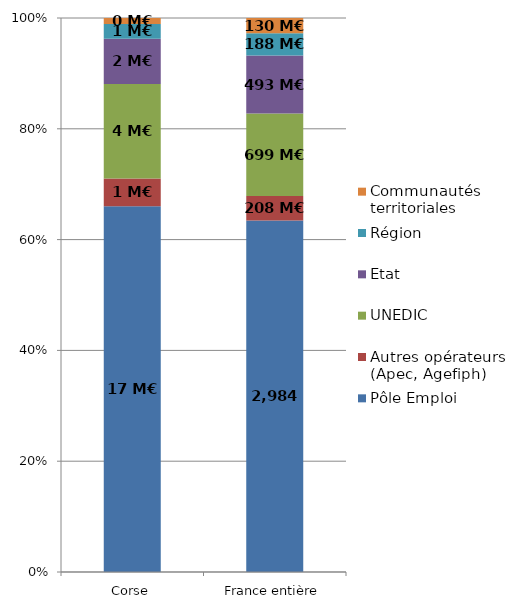
| Category | Pôle Emploi | Autres opérateurs (Apec, Agefiph) | UNEDIC | Etat | Région | Communautés territoriales |
|---|---|---|---|---|---|---|
| Corse | 16.502 | 1.248 | 4.265 | 2.038 | 0.663 | 0.272 |
| France entière | 2983.694 | 207.577 | 699.479 | 493.308 | 188.079 | 129.71 |